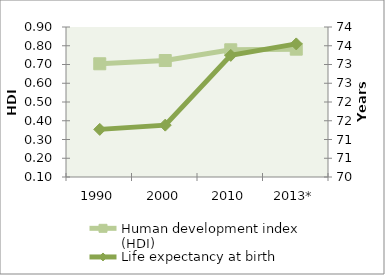
| Category | Human development index (HDI) |
|---|---|
| 1990 | 0.704 |
| 2000 | 0.721 |
| 2010 | 0.778 |
| 2013* | 0.782 |